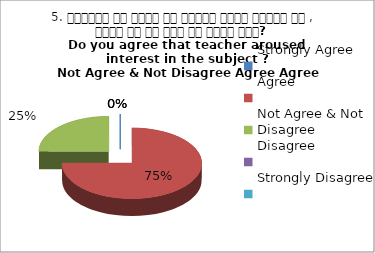
| Category | 5. शिक्षक ने विषय के प्रति रूचि जागृत की , क्या आप इस बात से सहमत हैं?  
Do you agree that teacher aroused interest in the subject ?
 Not Agree & Not Disagree Agree Agree Agree |
|---|---|
| Strongly Agree | 0 |
| Agree | 3 |
| Not Agree & Not Disagree | 1 |
| Disagree | 0 |
| Strongly Disagree | 0 |